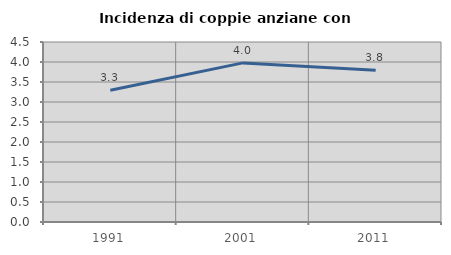
| Category | Incidenza di coppie anziane con figli |
|---|---|
| 1991.0 | 3.296 |
| 2001.0 | 3.978 |
| 2011.0 | 3.794 |